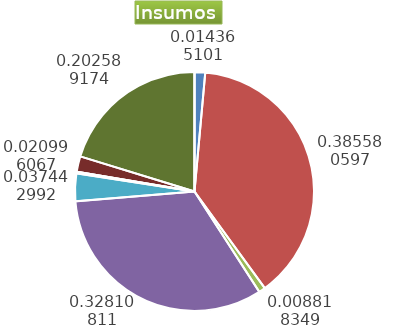
| Category | Series 0 |
|---|---|
| Control arvenses | 1853580 |
| Control fitosanitario | 49752833 |
| Cosecha y beneficio | 1137862.93 |
| Fertilización | 42336954 |
| Instalación | 4831402.123 |
| Otros | 270920 |
| Podas | 0 |
| Riego | 2709197 |
| Transporte | 26140800.2 |
| Tutorado | 0 |